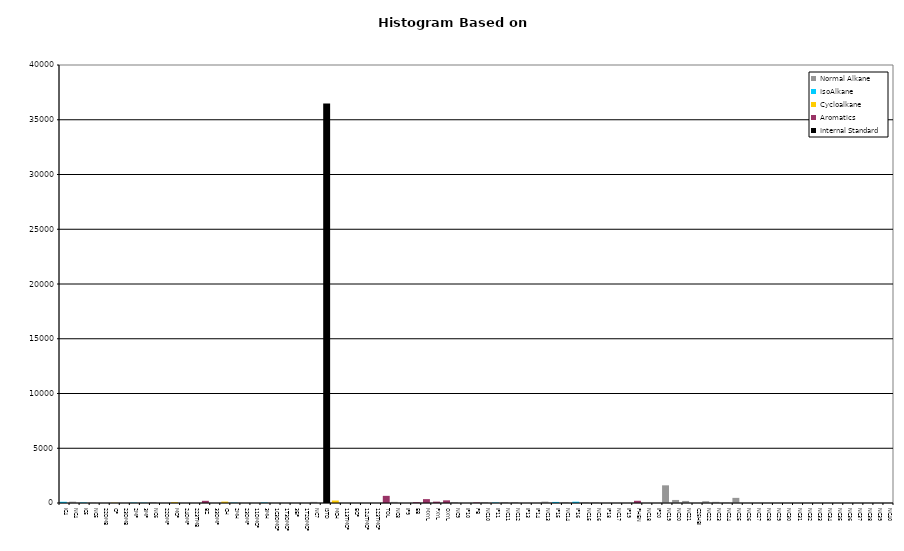
| Category | Normal Alkane | IsoAlkane | Cycloalkane | Aromatics | Internal Standard |
|---|---|---|---|---|---|
| IC4 | 0 | 111 | 0 | 0 | 0 |
| NC4 | 121 | 0 | 0 | 0 | 0 |
| IC5 | 0 | 48 | 0 | 0 | 0 |
| NC5 | 31 | 0 | 0 | 0 | 0 |
| 22DMB | 0 | 0 | 0 | 0 | 0 |
| CP | 0 | 0 | 23 | 0 | 0 |
| 23DMB | 0 | 0 | 0 | 0 | 0 |
| 2MP | 0 | 38 | 0 | 0 | 0 |
| 3MP | 0 | 29 | 0 | 0 | 0 |
| NC6 | 87 | 0 | 0 | 0 | 0 |
| 22DMP | 0 | 0 | 0 | 0 | 0 |
| MCP | 0 | 0 | 76 | 0 | 0 |
| 24DMP | 0 | 0 | 0 | 0 | 0 |
| 223TMB | 0 | 0 | 0 | 0 | 0 |
| BZ | 0 | 0 | 0 | 199 | 0 |
| 33DMP | 0 | 0 | 0 | 0 | 0 |
| CH | 0 | 0 | 127 | 0 | 0 |
| 2MH | 0 | 33 | 0 | 0 | 0 |
| 23DMP | 0 | 0 | 0 | 0 | 0 |
| 11DMCP | 0 | 0 | 0 | 0 | 0 |
| 3MH | 0 | 47 | 0 | 0 | 0 |
| 1C3DMCP | 0 | 0 | 0 | 0 | 0 |
| 1T3DMCP | 0 | 0 | 0 | 0 | 0 |
| 3EP | 0 | 0 | 0 | 0 | 0 |
| 1T2DMCP | 0 | 0 | 0 | 0 | 0 |
| NC7 | 101 | 0 | 0 | 0 | 0 |
| ISTD | 0 | 0 | 0 | 0 | 36488 |
| MCH | 0 | 0 | 227 | 0 | 0 |
| 113TMCP | 0 | 0 | 0 | 0 | 0 |
| ECP | 0 | 0 | 0 | 0 | 0 |
| 124TMCP | 0 | 0 | 0 | 0 | 0 |
| 123TMCP | 0 | 0 | 0 | 0 | 0 |
| TOL | 0 | 0 | 0 | 653 | 0 |
| NC8 | 101 | 0 | 0 | 0 | 0 |
| IP9 | 0 | 0 | 0 | 0 | 0 |
| EB | 0 | 0 | 0 | 72 | 0 |
| MXYL | 0 | 0 | 0 | 354 | 0 |
| PXYL | 0 | 0 | 0 | 124 | 0 |
| OXYL | 0 | 0 | 0 | 243 | 0 |
| NC9 | 77 | 0 | 0 | 0 | 0 |
| IP10 | 0 | 0 | 0 | 0 | 0 |
| PB | 0 | 0 | 0 | 50 | 0 |
| NC10 | 82 | 0 | 0 | 0 | 0 |
| IP11 | 0 | 45 | 0 | 0 | 0 |
| NC11 | 87 | 0 | 0 | 0 | 0 |
| NC12 | 86 | 0 | 0 | 0 | 0 |
| IP13 | 0 | 0 | 0 | 0 | 0 |
| IP14 | 0 | 0 | 0 | 0 | 0 |
| NC13 | 123 | 0 | 0 | 0 | 0 |
| IP15 | 0 | 97 | 0 | 0 | 0 |
| NC14 | 77 | 0 | 0 | 0 | 0 |
| IP16 | 0 | 118 | 0 | 0 | 0 |
| NC15 | 60 | 0 | 0 | 0 | 0 |
| NC16 | 58 | 0 | 0 | 0 | 0 |
| IP18 | 0 | 0 | 0 | 0 | 0 |
| NC17 | 0 | 0 | 0 | 0 | 0 |
| IP19 | 0 | 0 | 0 | 0 | 0 |
| PHEN | 0 | 0 | 0 | 203 | 0 |
| NC18 | 0 | 0 | 0 | 0 | 0 |
| IP20 | 0 | 0 | 0 | 0 | 0 |
| NC19 | 1614 | 0 | 0 | 0 | 0 |
| NC20 | 278 | 0 | 0 | 0 | 0 |
| NC21 | 189 | 0 | 0 | 0 | 0 |
| C25HBI | 0 | 0 | 0 | 0 | 0 |
| NC22 | 163 | 0 | 0 | 0 | 0 |
| NC23 | 105 | 0 | 0 | 0 | 0 |
| NC24 | 35 | 0 | 0 | 0 | 0 |
| NC25 | 469 | 0 | 0 | 0 | 0 |
| NC26 | 0 | 0 | 0 | 0 | 0 |
| NC27 | 0 | 0 | 0 | 0 | 0 |
| NC28 | 0 | 0 | 0 | 0 | 0 |
| NC29 | 0 | 0 | 0 | 0 | 0 |
| NC30 | 0 | 0 | 0 | 0 | 0 |
| NC31 | 0 | 0 | 0 | 0 | 0 |
| NC32 | 0 | 0 | 0 | 0 | 0 |
| NC33 | 0 | 0 | 0 | 0 | 0 |
| NC34 | 0 | 0 | 0 | 0 | 0 |
| NC35 | 0 | 0 | 0 | 0 | 0 |
| NC36 | 0 | 0 | 0 | 0 | 0 |
| NC37 | 0 | 0 | 0 | 0 | 0 |
| NC38 | 0 | 0 | 0 | 0 | 0 |
| NC39 | 0 | 0 | 0 | 0 | 0 |
| NC40 | 0 | 0 | 0 | 0 | 0 |